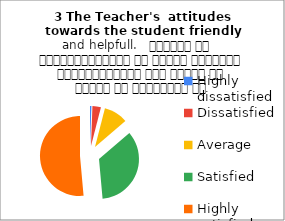
| Category | 3 The Teacher's  attitudes towards the student friendly and helpfull.   शिक्षक का विद्यार्थियों के प्रति व्यवहार मित्रतापूर्ण एवम सहयोग के भावना से परिपूर्ण था |
|---|---|
| Highly dissatisfied | 1 |
| Dissatisfied | 6 |
| Average | 17 |
| Satisfied | 61 |
| Highly satisfied | 90 |